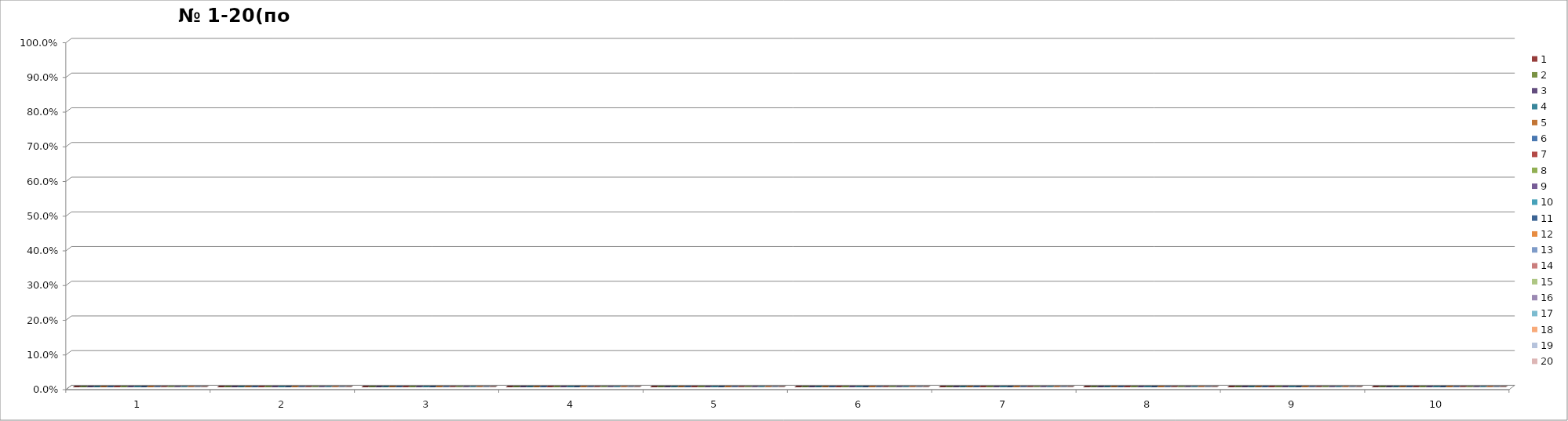
| Category | 1 | 2 | 3 | 4 | 5 | 6 | 7 | 8 | 9 | 10 | 11 | 12 | 13 | 14 | 15 | 16 | 17 | 18 | 19 | 20 |
|---|---|---|---|---|---|---|---|---|---|---|---|---|---|---|---|---|---|---|---|---|
| 0 | 0 | 0 | 0 | 0 | 0 | 0 | 0 | 0 | 0 | 0 | 0 | 0 | 0 | 0 | 0 | 0 | 0 | 0 | 0 | 0 |
| 1 | 0 | 0 | 0 | 0 | 0 | 0 | 0 | 0 | 0 | 0 | 0 | 0 | 0 | 0 | 0 | 0 | 0 | 0 | 0 | 0 |
| 2 | 0 | 0 | 0 | 0 | 0 | 0 | 0 | 0 | 0 | 0 | 0 | 0 | 0 | 0 | 0 | 0 | 0 | 0 | 0 | 0 |
| 3 | 0 | 0 | 0 | 0 | 0 | 0 | 0 | 0 | 0 | 0 | 0 | 0 | 0 | 0 | 0 | 0 | 0 | 0 | 0 | 0 |
| 4 | 0 | 0 | 0 | 0 | 0 | 0 | 0 | 0 | 0 | 0 | 0 | 0 | 0 | 0 | 0 | 0 | 0 | 0 | 0 | 0 |
| 5 | 0 | 0 | 0 | 0 | 0 | 0 | 0 | 0 | 0 | 0 | 0 | 0 | 0 | 0 | 0 | 0 | 0 | 0 | 0 | 0 |
| 6 | 0 | 0 | 0 | 0 | 0 | 0 | 0 | 0 | 0 | 0 | 0 | 0 | 0 | 0 | 0 | 0 | 0 | 0 | 0 | 0 |
| 7 | 0 | 0 | 0 | 0 | 0 | 0 | 0 | 0 | 0 | 0 | 0 | 0 | 0 | 0 | 0 | 0 | 0 | 0 | 0 | 0 |
| 8 | 0 | 0 | 0 | 0 | 0 | 0 | 0 | 0 | 0 | 0 | 0 | 0 | 0 | 0 | 0 | 0 | 0 | 0 | 0 | 0 |
| 9 | 0 | 0 | 0 | 0 | 0 | 0 | 0 | 0 | 0 | 0 | 0 | 0 | 0 | 0 | 0 | 0 | 0 | 0 | 0 | 0 |